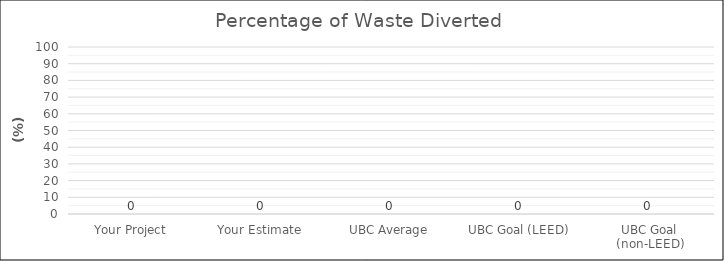
| Category | Percentage of Waste Diverted  |
|---|---|
| Your Project | 0 |
| Your Estimate | 0 |
| UBC Average | 0 |
| UBC Goal (LEED) | 0 |
| UBC Goal (non-LEED) | 0 |